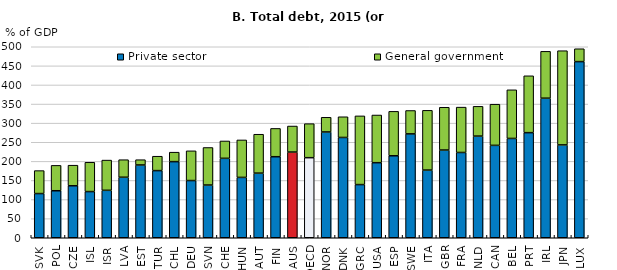
| Category | Private sector | General government |
|---|---|---|
| SVK | 115.714 | 60.116 |
| POL | 123.042 | 66.424 |
| CZE | 136.053 | 53.915 |
| ISL | 120.908 | 76.683 |
| ISR | 124.205 | 79.098 |
| LVA | 158.418 | 45.91 |
| EST | 190.558 | 13.791 |
| TUR | 175.791 | 37.681 |
| CHL | 199.269 | 24.761 |
| DEU | 149.747 | 77.818 |
| SVN | 138.027 | 98.252 |
| CHE | 207.911 | 45.476 |
| HUN | 158.004 | 98.072 |
| AUT | 169.15 | 101.839 |
| FIN | 212.125 | 74.077 |
| AUS | 224.377 | 68.103 |
| OECD | 209.618 | 89.021 |
| NOR | 276.941 | 38.428 |
| DNK | 262.534 | 54.21 |
| GRC | 139.182 | 179.858 |
| USA | 196.524 | 124.798 |
| ESP | 214.615 | 116.293 |
| SWE | 271.951 | 61.202 |
| ITA | 177.174 | 156.424 |
| GBR | 229.641 | 111.998 |
| FRA | 223.215 | 118.77 |
| NLD | 266.143 | 77.899 |
| CAN | 241.875 | 107.724 |
| BEL | 260.004 | 127.283 |
| PRT | 275.131 | 148.83 |
| IRL | 365.35 | 122.702 |
| JPN | 243.083 | 246.579 |
| LUX | 461.12 | 33.67 |